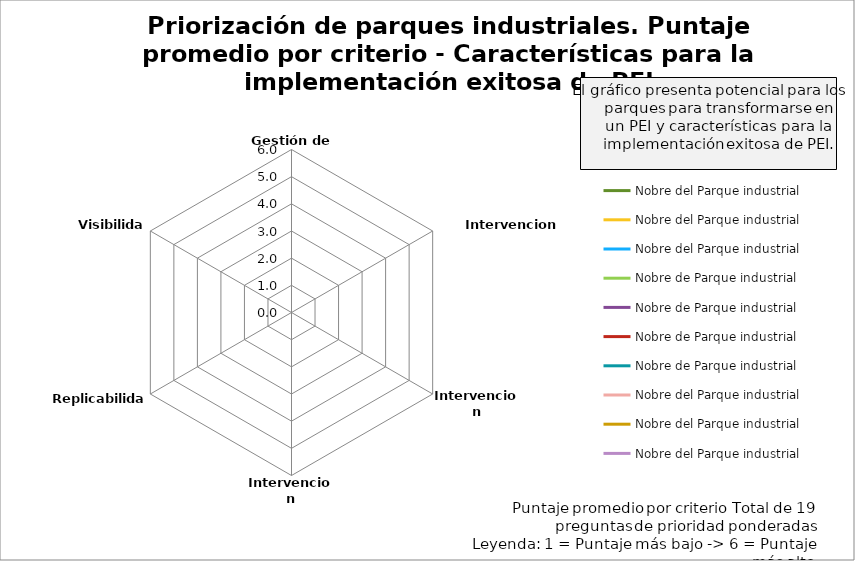
| Category | Nobre del Parque industrial | Nobre de Parque industrial |
|---|---|---|
| Gestión de parque | 0 | 0 |
| Intervencion ambiental | 0 | 0 |
| Intervencion ambientales | 0 | 0 |
| Intervencion económicas | 0 | 0 |
| Replicabilidad | 0 | 0 |
| Visibilidad | 0 | 0 |